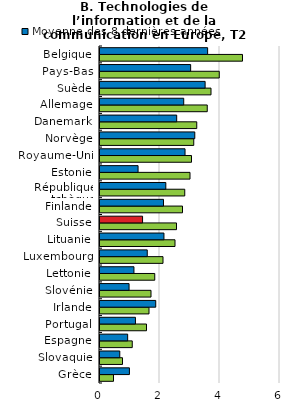
| Category | Moyenne des 4 derniers trimestres | Moyenne des 8 dernières années |
|---|---|---|
| Grèce | 0.45 | 0.981 |
| Slovaquie | 0.75 | 0.659 |
| Espagne | 1.075 | 0.922 |
| Portugal | 1.55 | 1.181 |
| Irlande | 1.633 | 1.858 |
| Slovénie | 1.7 | 0.969 |
| Lettonie | 1.825 | 1.131 |
| Luxembourg | 2.1 | 1.575 |
| Lituanie | 2.5 | 2.131 |
| Suisse | 2.55 | 1.419 |
| Finlande | 2.75 | 2.117 |
| République tchèque | 2.825 | 2.194 |
| Estonie | 3 | 1.269 |
| Royaume-Uni | 3.05 | 2.834 |
| Norvège | 3.125 | 3.159 |
| Danemark | 3.225 | 2.557 |
| Allemage | 3.575 | 2.791 |
| Suède | 3.7 | 3.504 |
| Pays-Bas | 3.975 | 3.021 |
| Belgique | 4.75 | 3.588 |